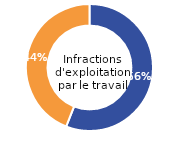
| Category | Infractions d'exploitation de la mendicité  |
|---|---|
| Femme (%) | 56 |
| Homme (%) | 44 |